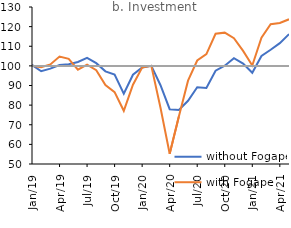
| Category | without Fogape | with Fogape | Series 2 |
|---|---|---|---|
| 2019-01-01 | 100.489 | 100.134 | 100 |
| 2019-02-01 | 97.28 | 99.344 | 100 |
| 2019-03-01 | 98.602 | 100.741 | 100 |
| 2019-04-01 | 100.424 | 104.739 | 100 |
| 2019-05-01 | 100.788 | 103.596 | 100 |
| 2019-06-01 | 102.011 | 98.062 | 100 |
| 2019-07-01 | 104.101 | 100.649 | 100 |
| 2019-08-01 | 101.393 | 97.79 | 100 |
| 2019-09-01 | 97.223 | 90.281 | 100 |
| 2019-10-01 | 95.554 | 86.607 | 100 |
| 2019-11-01 | 85.837 | 77.107 | 100 |
| 2019-12-01 | 95.474 | 90.397 | 100 |
| 2020-01-01 | 99.19 | 99.115 | 100 |
| 2020-02-01 | 100 | 100 | 100 |
| 2020-03-01 | 90.145 | 78.655 | 100 |
| 2020-04-01 | 77.932 | 55.211 | 100 |
| 2020-05-01 | 77.572 | 74.2 | 100 |
| 2020-06-01 | 82.215 | 92.452 | 100 |
| 2020-07-01 | 89.14 | 102.726 | 100 |
| 2020-08-01 | 88.776 | 105.998 | 100 |
| 2020-09-01 | 97.53 | 116.362 | 100 |
| 2020-10-01 | 100.095 | 116.938 | 100 |
| 2020-11-01 | 103.899 | 114.104 | 100 |
| 2020-12-01 | 101.143 | 107.628 | 100 |
| 2021-01-01 | 96.48 | 100.183 | 100 |
| 2021-02-01 | 105.024 | 114.323 | 100 |
| 2021-03-01 | 108.212 | 121.208 | 100 |
| 2021-04-01 | 111.586 | 121.827 | 100 |
| 2021-05-01 | 116.19 | 123.735 | 100 |